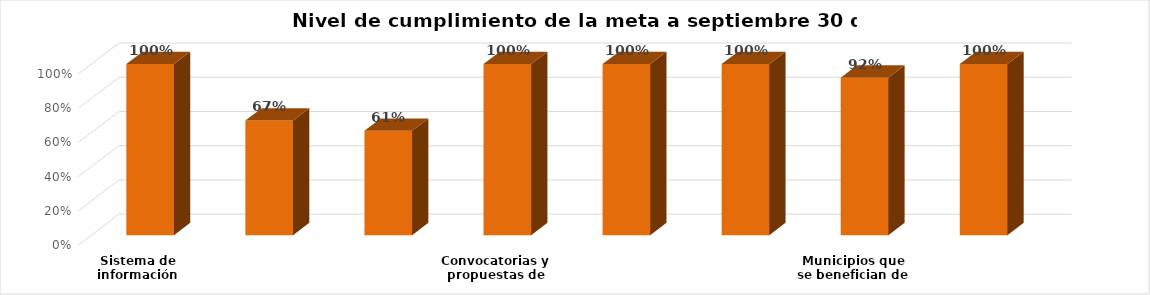
| Category | Nivel de cumplimiento de la meta a septiembre 30 de 2021 |
|---|---|
| Sistema de información cultural del Instituto de Cultura y Patrimonio implementado | 1 |
| Actores sociales formados en artes y otras manifestaciones | 0.67 |
| Eventos realizados | 0.61 |
| Convocatorias y propuestas de estímulos para el arte y la cultura realizadas | 1 |
| Estrategias de gestión implementadas en planificación cultural y gestión | 1 |
| Bibliotecas públicas municipales y escolares que participan en procesos de lectura y escritura | 1 |
| Municipios que se benefician de los procesos de salvaguardia del patrimonio cultural | 0.92 |
| Estrategia tecnológica del Instituto de Cultura y Patrimonio implementada | 1 |